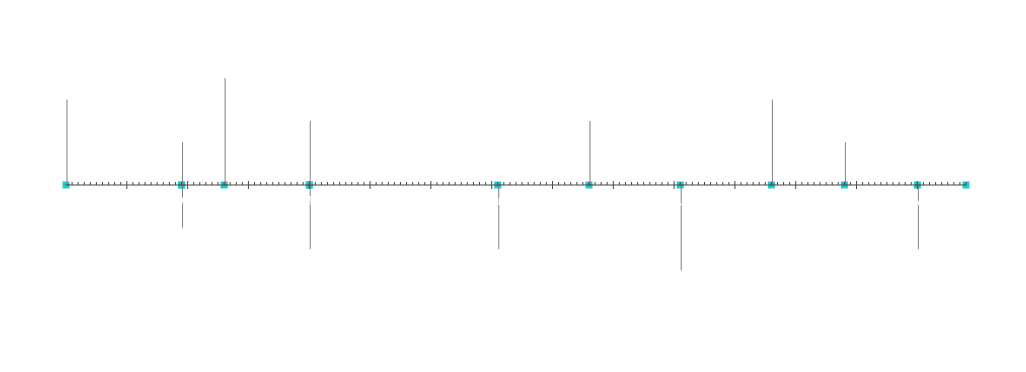
| Category | Kedudukan |
|---|---|
| Projek Bermula | 20 |
| Peristiwa 1 | 10 |
| Peristiwa 2 | -10 |
| Peristiwa 3 | 25 |
| Peristiwa 4 | -15 |
| Peristiwa 5 | 15 |
| Peristiwa 6 | -15 |
| Peristiwa 7 | 15 |
| Peristiwa 8 | -20 |
| Peristiwa 9 | 20 |
| Peristiwa 10 | -15 |
| Peristiwa 11 | 10 |
| Projek Tamat | 5 |